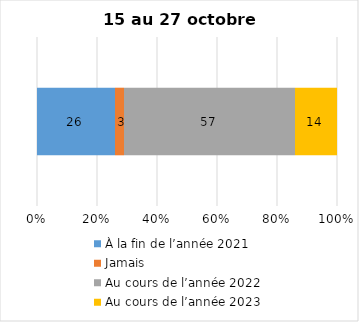
| Category | À la fin de l’année 2021 | Jamais | Au cours de l’année 2022 | Au cours de l’année 2023 |
|---|---|---|---|---|
| 0 | 26 | 3 | 57 | 14 |